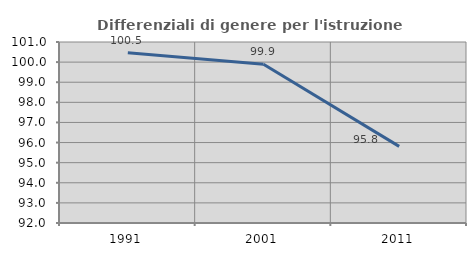
| Category | Differenziali di genere per l'istruzione superiore |
|---|---|
| 1991.0 | 100.465 |
| 2001.0 | 99.891 |
| 2011.0 | 95.81 |